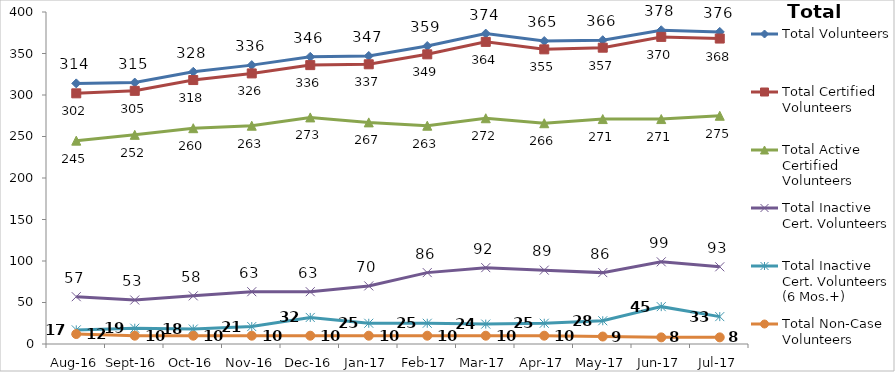
| Category | Total Volunteers | Total Certified Volunteers | Total Active Certified Volunteers | Total Inactive Cert. Volunteers | Total Inactive Cert. Volunteers (6 Mos.+) | Total Non-Case Volunteers |
|---|---|---|---|---|---|---|
| Aug-16 | 314 | 302 | 245 | 57 | 17 | 12 |
| Sep-16 | 315 | 305 | 252 | 53 | 19 | 10 |
| Oct-16 | 328 | 318 | 260 | 58 | 18 | 10 |
| Nov-16 | 336 | 326 | 263 | 63 | 21 | 10 |
| Dec-16 | 346 | 336 | 273 | 63 | 32 | 10 |
| Jan-17 | 347 | 337 | 267 | 70 | 25 | 10 |
| Feb-17 | 359 | 349 | 263 | 86 | 25 | 10 |
| Mar-17 | 374 | 364 | 272 | 92 | 24 | 10 |
| Apr-17 | 365 | 355 | 266 | 89 | 25 | 10 |
| May-17 | 366 | 357 | 271 | 86 | 28 | 9 |
| Jun-17 | 378 | 370 | 271 | 99 | 45 | 8 |
| Jul-17 | 376 | 368 | 275 | 93 | 33 | 8 |